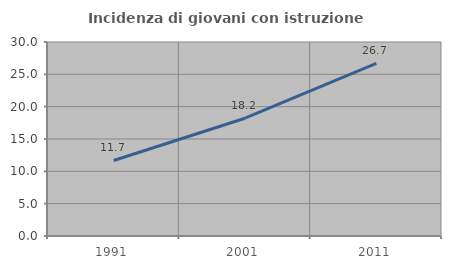
| Category | Incidenza di giovani con istruzione universitaria |
|---|---|
| 1991.0 | 11.677 |
| 2001.0 | 18.215 |
| 2011.0 | 26.708 |